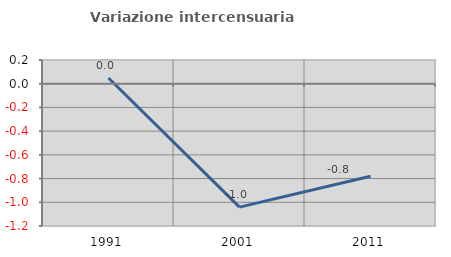
| Category | Variazione intercensuaria annua |
|---|---|
| 1991.0 | 0.048 |
| 2001.0 | -1.041 |
| 2011.0 | -0.78 |